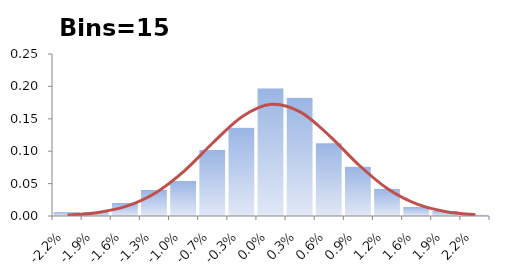
| Category | Series 0 |
|---|---|
| -0.022457939360638078 | 0.006 |
| -0.019282390212811456 | 0.006 |
| -0.016106841064984834 | 0.02 |
| -0.012931291917158213 | 0.04 |
| -0.009755742769331593 | 0.054 |
| -0.00658019362150497 | 0.102 |
| -0.0034046444736783475 | 0.137 |
| -0.00022909532585172789 | 0.197 |
| 0.0029464538219748917 | 0.183 |
| 0.006122002969801513 | 0.112 |
| 0.009297552117628135 | 0.076 |
| 0.012473101265454757 | 0.042 |
| 0.01564865041328138 | 0.014 |
| 0.018824199561108 | 0.008 |
| 0.021999748708934622 | 0.002 |